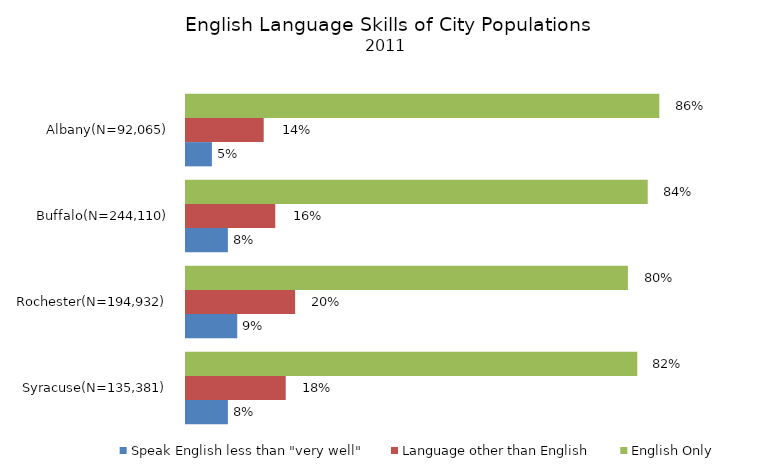
| Category | Speak English less than "very well" | Language other than English | English Only |
|---|---|---|---|
| Syracuse(N=135,381) | 0.076 | 0.181 | 0.819 |
| Rochester(N=194,932) | 0.093 | 0.198 | 0.802 |
| Buffalo(N=244,110) | 0.076 | 0.162 | 0.838 |
| Albany(N=92,065) | 0.047 | 0.141 | 0.859 |